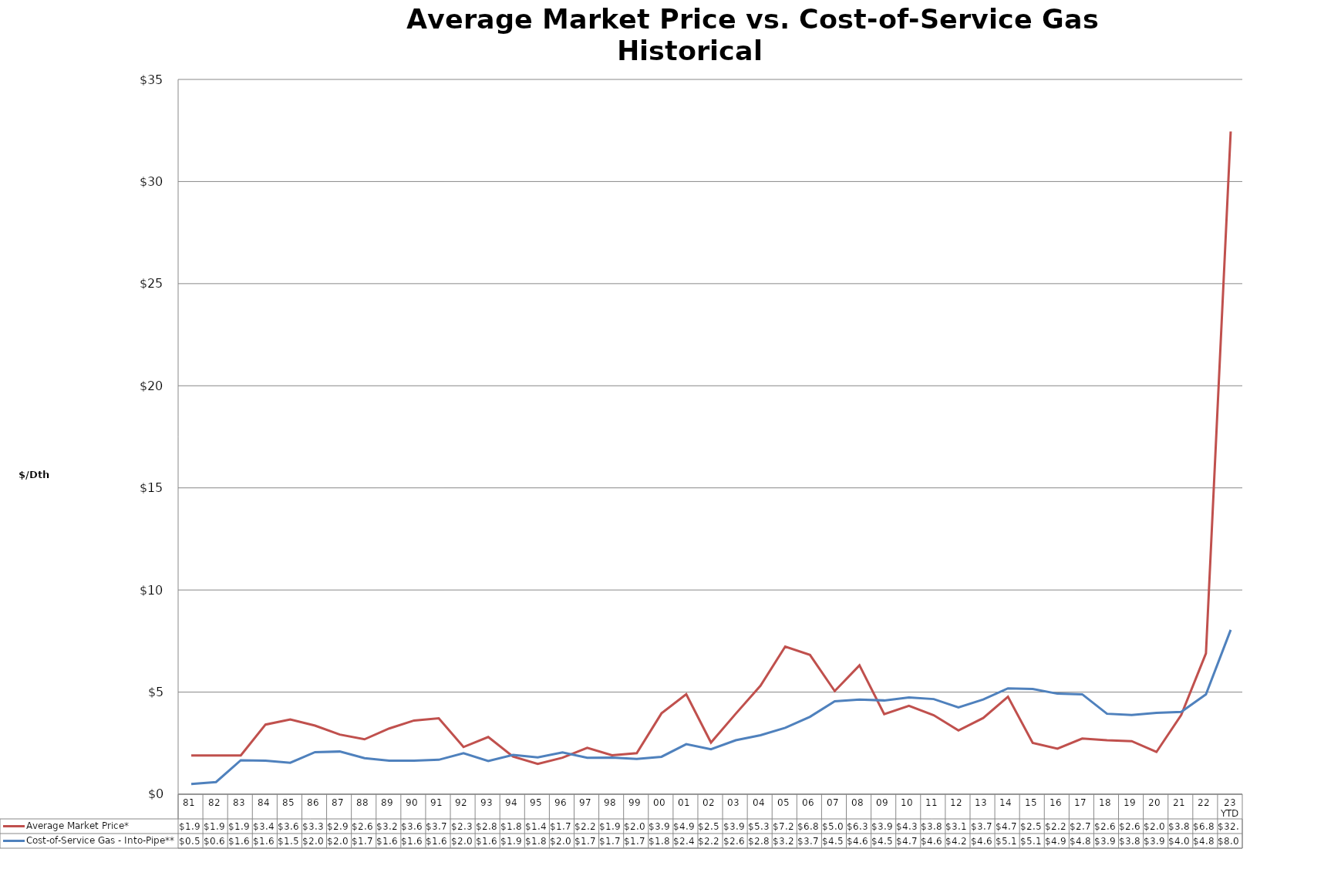
| Category | Average Market Price* | Cost-of-Service Gas - Into-Pipe** |
|---|---|---|
| 81 | 1.9 | 0.502 |
| 82 | 1.9 | 0.596 |
| 83 | 1.9 | 1.665 |
| 84 | 3.41 | 1.643 |
| 85 | 3.66 | 1.543 |
| 86 | 3.36 | 2.059 |
| 87 | 2.92 | 2.091 |
| 88 | 2.69 | 1.764 |
| 89 | 3.22 | 1.644 |
| 90 | 3.61 | 1.642 |
| 91 | 3.72 | 1.685 |
| 92 | 2.31 | 2.005 |
| 93 | 2.8 | 1.623 |
| 94 | 1.84 | 1.926 |
| 95 | 1.48 | 1.804 |
| 96 | 1.79 | 2.052 |
| 97 | 2.27 | 1.787 |
| 98 | 1.91 | 1.795 |
| 99 | 2.01 | 1.725 |
| 00 | 3.96 | 1.833 |
| 01 | 4.9 | 2.448 |
| 02 | 2.53 | 2.204 |
| 03 | 3.94 | 2.644 |
| 04 | 5.31 | 2.891 |
| 05 | 7.23 | 3.251 |
| 06 | 6.82 | 3.792 |
| 07 | 5.05 | 4.551 |
| 08 | 6.31 | 4.632 |
| 09 | 3.92 | 4.592 |
| 10 | 4.33 | 4.74 |
| 11 | 3.87 | 4.658 |
| 12 | 3.12 | 4.253 |
| 13 | 3.73 | 4.641 |
| 14 | 4.77 | 5.184 |
| 15 | 2.51 | 5.151 |
| 16 | 2.233 | 4.923 |
| 17 | 2.725 | 4.894 |
| 18 | 2.639 | 3.94 |
| 19 | 2.599 | 3.877 |
| 20 | 2.067 | 3.981 |
| 21 | 3.88 | 4.027 |
| 22 | 6.895 | 4.892 |
| 23 YTD | 32.45 | 8.046 |